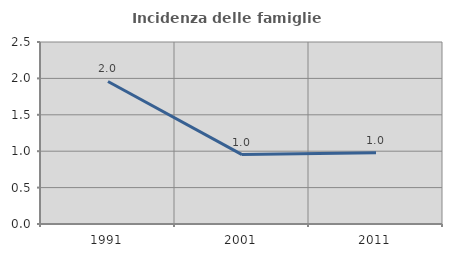
| Category | Incidenza delle famiglie numerose |
|---|---|
| 1991.0 | 1.958 |
| 2001.0 | 0.953 |
| 2011.0 | 0.98 |